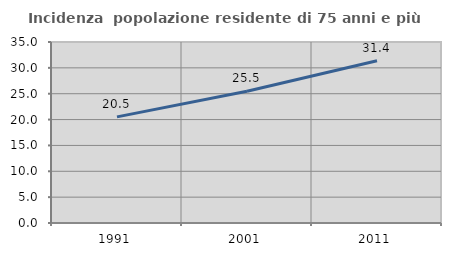
| Category | Incidenza  popolazione residente di 75 anni e più |
|---|---|
| 1991.0 | 20.523 |
| 2001.0 | 25.473 |
| 2011.0 | 31.368 |